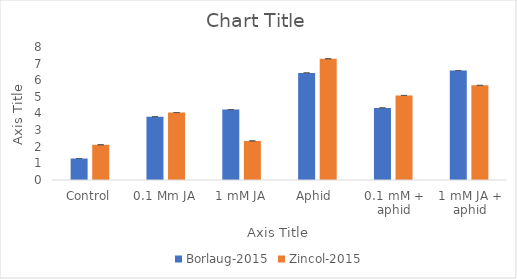
| Category | Borlaug-2015 | Zincol-2015 |
|---|---|---|
| Control | 1.292 | 2.118 |
| 0.1 Mm JA | 3.811 | 4.058 |
| 1 mM JA | 4.234 | 2.351 |
| Aphid  | 6.439 | 7.295 |
| 0.1 mM + aphid | 4.338 | 5.086 |
| 1 mM JA + aphid | 6.585 | 5.692 |